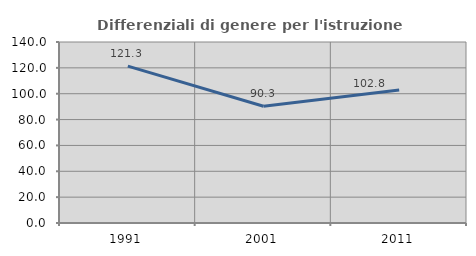
| Category | Differenziali di genere per l'istruzione superiore |
|---|---|
| 1991.0 | 121.337 |
| 2001.0 | 90.269 |
| 2011.0 | 102.797 |